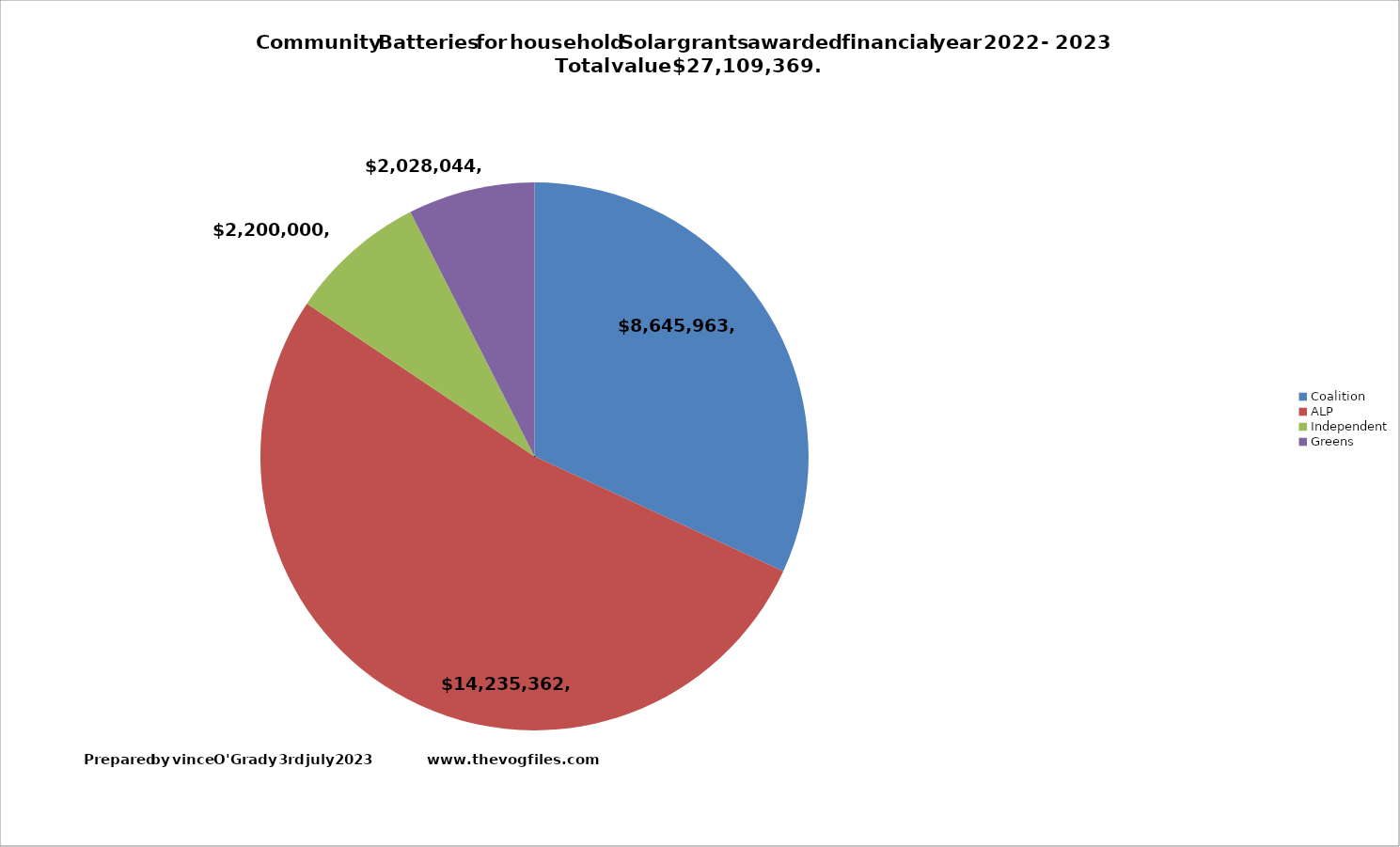
| Category | Series 0 |
|---|---|
| Coalition | 8645963.4 |
| ALP | 14235362.4 |
| Independent | 2200000 |
| Greens | 2028043.6 |